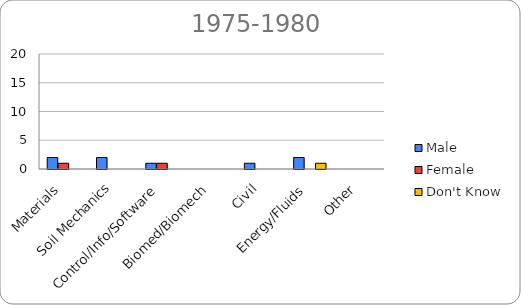
| Category | Male | Female | Don't Know |
|---|---|---|---|
| Materials | 2 | 1 | 0 |
| Soil Mechanics | 2 | 0 | 0 |
| Control/Info/Software | 1 | 1 | 0 |
| Biomed/Biomech | 0 | 0 | 0 |
| Civil | 1 | 0 | 0 |
| Energy/Fluids | 2 | 0 | 1 |
| Other | 0 | 0 | 0 |